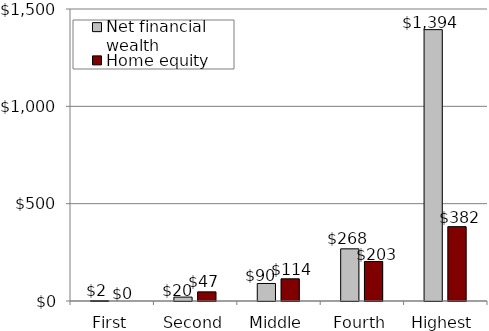
| Category | Net financial wealth | Home equity |
|---|---|---|
| First | 2 | 0 |
| Second | 20 | 47 |
| Middle | 90 | 114 |
| Fourth | 268 | 203 |
| Highest | 1394 | 382 |